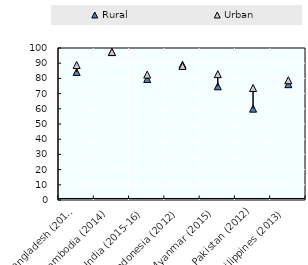
| Category | Rural | Urban |
|---|---|---|
| Bangladesh (2014) | 84.2 | 88.8 |
| Cambodia (2014) | 97.3 | 97.4 |
| India (2015-16) | 79.6 | 82.5 |
| Indonesia (2012) | 89 | 88.2 |
| Myanmar (2015) | 74.8 | 82.8 |
| Pakistan (2012) | 60.1 | 73.7 |
| Philippines (2013) | 76.2 | 78.8 |